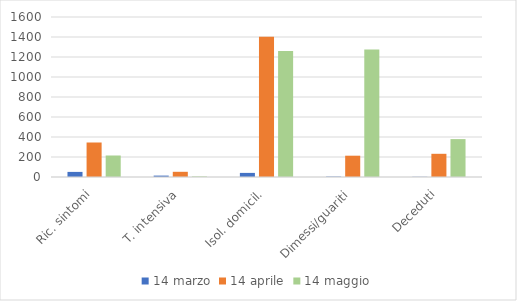
| Category | 14 marzo | 14 aprile | 14 maggio |
|---|---|---|---|
| Ric. sintomi | 51 | 345 | 215 |
| T. intensiva | 14 | 52 | 6 |
| Isol. domicil. | 41 | 1403 | 1261 |
| Dimessi/guariti | 4 | 213 | 1275 |
| Deceduti | 2 | 232 | 379 |